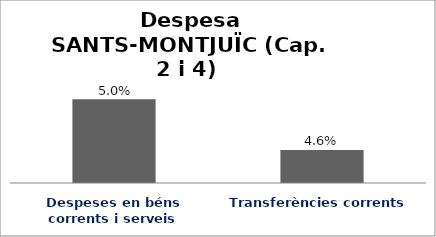
| Category | Series 0 |
|---|---|
| Despeses en béns corrents i serveis | 0.05 |
| Transferències corrents | 0.046 |